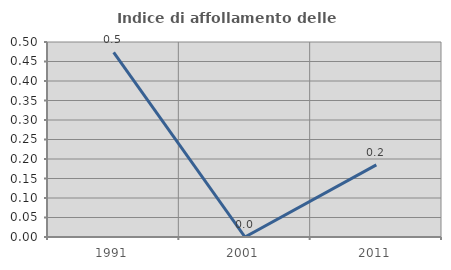
| Category | Indice di affollamento delle abitazioni  |
|---|---|
| 1991.0 | 0.473 |
| 2001.0 | 0 |
| 2011.0 | 0.185 |